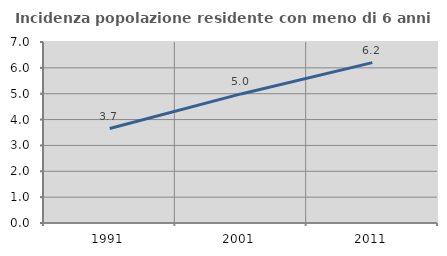
| Category | Incidenza popolazione residente con meno di 6 anni |
|---|---|
| 1991.0 | 3.653 |
| 2001.0 | 4.992 |
| 2011.0 | 6.204 |